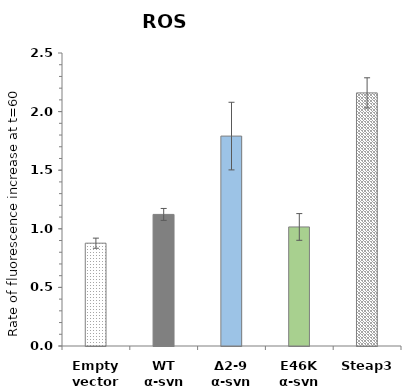
| Category | Untreated |
|---|---|
| Empty vector | 0.877 |
| WT α-syn | 1.123 |
| Δ2-9 α-syn | 1.791 |
| E46K α-syn | 1.016 |
| Steap3 | 2.16 |